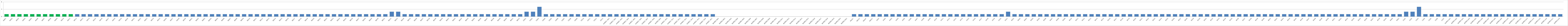
| Category | Series 0 |
|---|---|
| AW01 | 1 |
| AW02 | 1 |
| AW03 | 1 |
| AW04 | 1 |
| AW05 | 1 |
| AW06 | 1 |
| AW07 | 1 |
| AW08 | 1 |
| AW09 | 1 |
| AW10 | 1 |
| AW11 | 1 |
| AW12 | 1 |
| AW13 | 1 |
| AW14 | 1 |
| AW15 | 1 |
| AW16 | 1 |
| AW17 | 1 |
| AW18 | 1 |
| AW19 | 1 |
| AW20 | 1 |
| AW21 | 1 |
| AW22 | 1 |
| AW23 | 1 |
| AW24 | 1 |
| AW25 | 1 |
| AW26 | 1 |
| AW27 | 1 |
| AW28 | 1 |
| AW29 | 1 |
| BW01 | 1 |
| BW02 | 1 |
| BW03 | 1 |
| BWO4 | 1 |
| BW05 | 1 |
| BW06 | 1 |
| BW07 | 1 |
| BW08 | 1 |
| BW09 | 1 |
| BW10 | 1 |
| BW11 | 1 |
| BW12 | 1 |
| BW13 | 1 |
| BW14 | 1 |
| BW15 | 1 |
| BW16 | 1 |
| BW17 | 1 |
| BW18 | 1 |
| BW19 | 1 |
| BW20 | 1 |
| BW21 | 1 |
| BW22 | 1 |
| BW23 | 1 |
| BW24 | 1 |
| BW25 | 1 |
| BW26 | 1 |
| BW27 | 1 |
| BW28 | 1 |
| BW29 | 1 |
| BW30 | 1 |
| BW31 | 1 |
| BW32 | 2 |
| BW33 | 2 |
| BW34 | 1 |
| BW35 | 1 |
| BW36 | 1 |
| BW37 | 1 |
| BW38 | 1 |
| BW39 | 1 |
| BW40 | 1 |
| BW41 | 1 |
| BW42 | 1 |
| BW43 | 1 |
| BW44 | 1 |
| BW45 | 1 |
| BW46 | 1 |
| BW47 | 1 |
| BW48 | 1 |
| BW49 | 1 |
| BW50 | 1 |
| BW51 | 1 |
| BW52 | 1 |
| CW01 | 2 |
| CW02 | 2 |
| CW03 | 4 |
| CW04 | 1 |
| CW05 | 1 |
| CW06 | 1 |
| CW07 | 1 |
| CW08 | 1 |
| CW09 | 1 |
| CW10 | 1 |
| CW11 | 1 |
| CW12 | 1 |
| CW13 | 1 |
| AUMED. W01 | 1 |
| AUMED. W02 | 1 |
| AUMED. W03 | 1 |
| AUMED. W04 | 1 |
| AUMED. W05 | 1 |
| AUMED. W06 | 1 |
| AUMED. W07 | 1 |
| AUMED. W08 | 1 |
| AUMED.W09 | 1 |
| AUMED. W10 | 1 |
| AUMED. W11 | 1 |
| AUMED. W12 | 1 |
| AUMED. W13 | 1 |
| AUMED. W14 | 1 |
| AUMED. W15 | 1 |
| AUMED. W16 | 1 |
| AUMED. W17 | 1 |
| BUMED.W01 | 0 |
| BUMED.W02 | 0 |
| BUMED.W03 | 0 |
| BUMED.W04 | 0 |
| BUMED.W05 | 0 |
| BUMED.W06 | 0 |
| BUMED.W07 | 0 |
| BUMED.W08 | 0 |
| BUMED.W09 | 0 |
| BUMED.W10 | 0 |
| BUMED.W11 | 0 |
| BUMED.W12 | 0 |
| BUMED.W13 | 0 |
| BUMED.W14 | 0 |
| BUMED.W15 | 0 |
| BUMED.W16 | 0 |
| BUMED.W17 | 0 |
| BUMED.W18 | 0 |
| BUMED.W19 | 0 |
| BUMED.W20 | 0 |
| BUMED.W21 | 0 |
| AW22* | 1 |
| AW23* | 1 |
| AW24* | 1 |
| AW25* | 1 |
| AU01 | 1 |
| AU02 | 1 |
| AU03 | 1 |
| AU04 | 1 |
| AU05 | 1 |
| AU06 | 1 |
| AU07 | 1 |
| AU08 | 1 |
| AU09 | 1 |
| AU10 | 1 |
| AU11 | 1 |
| AU12 | 1 |
| AU13 | 1 |
| AU14 | 1 |
| AU15 | 1 |
| AU16 | 1 |
| AU17 | 1 |
| AU18 | 1 |
| AU19 | 1 |
| AU20 | 1 |
| AU21 | 2 |
| BU01 | 1 |
| BU02 | 1 |
| BU03 | 1 |
| BU04 | 1 |
| BU05 | 1 |
| BU06 | 1 |
| BU07 | 1 |
| BU08 | 1 |
| BU09 | 1 |
| BU10 | 1 |
| BU11 | 1 |
| BU12 | 1 |
| BU13 | 1 |
| BU14 | 1 |
| BU15 | 1 |
| BU16 | 1 |
| BU17 | 1 |
| BU18 | 1 |
| BU19 | 1 |
| BU20 | 1 |
| BU21 | 1 |
| BU22 | 1 |
| BU23 | 1 |
| BU24 | 1 |
| BU25 | 1 |
| BU26 | 1 |
| BU27 | 1 |
| BU28 | 1 |
| BU29 | 1 |
| BU30 | 1 |
| BU31 | 1 |
| BU32 | 1 |
| BU33 | 1 |
| BU34 | 1 |
| BU35 | 1 |
| BU36 | 1 |
| BU37 | 1 |
| BU38 | 1 |
| BU39 | 1 |
| BU40 | 1 |
| BU41 | 1 |
| BU42 | 1 |
| BU43 | 1 |
| BU44 | 1 |
| BU45 | 1 |
| BU46 | 1 |
| BU47 | 1 |
| BU48 | 1 |
| BU49 | 1 |
| BU50 | 1 |
| BU51 | 1 |
| BU52 | 1 |
| BU53 | 1 |
| BU54 | 1 |
| BU55 | 1 |
| BU56 | 1 |
| BU57 | 1 |
| BU58 | 1 |
| BU59 | 1 |
| BU60 | 1 |
| BU61 | 1 |
| CU01 | 2 |
| CU02 | 2 |
| CU03 | 4 |
| CU04 | 1 |
| CU05 | 1 |
| CU06 | 1 |
| CU07 | 1 |
| AUMED.U01 | 1 |
| AUMED.U02 | 1 |
| AUMED.U03 | 1 |
| AUMED.U04 | 1 |
| AUMED.U05 | 1 |
| AUMED.U06 | 1 |
| AUMED.U07 | 1 |
| AUMED.U08 | 1 |
| AUMED.U09 | 1 |
| AUMED.U10 | 1 |
| AUMED.U11 | 1 |
| AUMED.U12 | 1 |
| AUMED.U13 | 1 |
| AUMED.U14 | 1 |
| AUMED.U15 | 1 |
| AUMED.U16 | 1 |
| AUMED.U17 | 1 |
| AUMED.U18 | 1 |